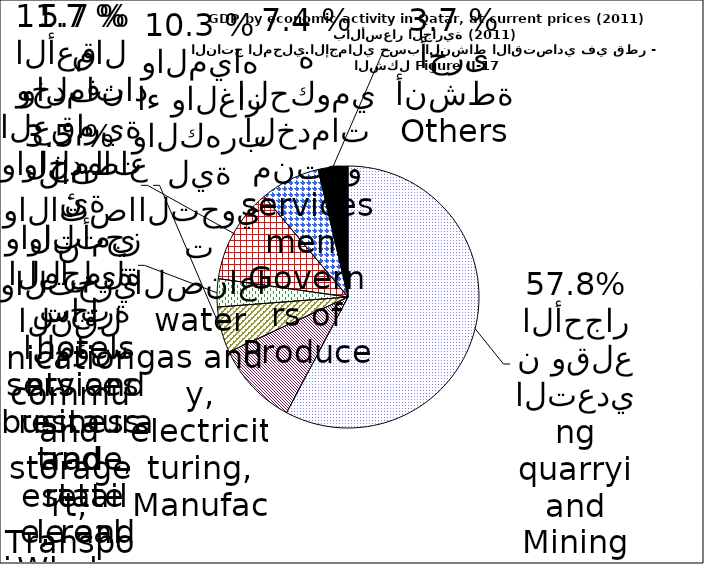
| Category | Series 0 |
|---|---|
| Mining and quarrying | 364458 |
| Manufacturing, electricity, gas and water | 65254 |
| Wholesale and retail trade, restaurants and hotels | 35696 |
| Transport, storage and communication | 21892 |
| Financial institutions, insurance,real estate and business services | 73727 |
| Producers of government services | 46736 |
| Others | 23120 |